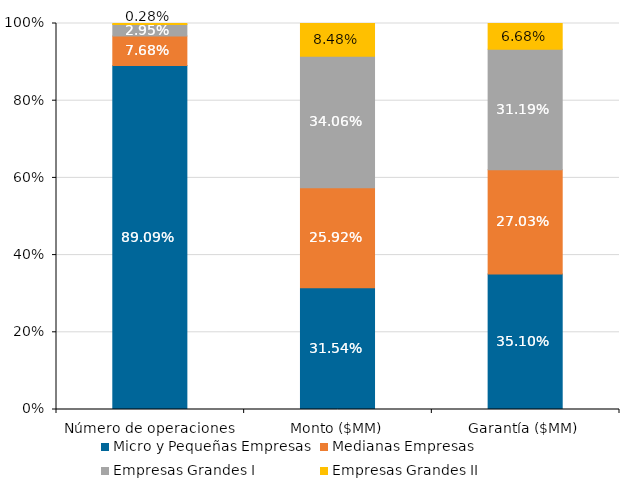
| Category | Micro y Pequeñas Empresas | Medianas Empresas | Empresas Grandes I | Empresas Grandes II |
|---|---|---|---|---|
| Número de operaciones | 0.891 | 0.077 | 0.029 | 0.003 |
| Monto ($MM) | 0.315 | 0.259 | 0.341 | 0.085 |
| Garantía ($MM) | 0.351 | 0.27 | 0.312 | 0.067 |